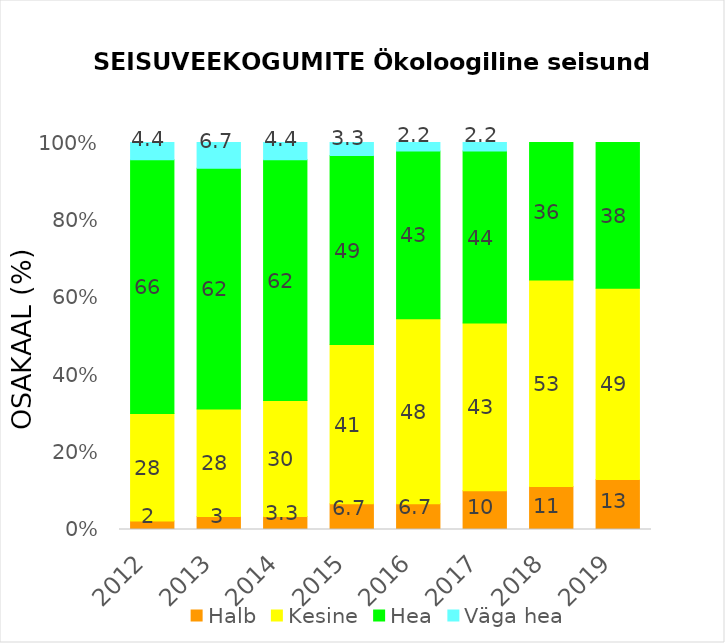
| Category | Halb | Kesine | Hea | Väga hea |
|---|---|---|---|---|
| 2012.0 | 2.222 | 27.778 | 65.556 | 4.444 |
| 2013.0 | 3.333 | 27.778 | 62.222 | 6.667 |
| 2014.0 | 3.333 | 30 | 62.222 | 4.444 |
| 2015.0 | 6.667 | 41.111 | 48.889 | 3.333 |
| 2016.0 | 6.667 | 47.778 | 43.333 | 2.222 |
| 2017.0 | 10 | 43.333 | 44.444 | 2.222 |
| 2018.0 | 11.111 | 53.333 | 35.556 | 0 |
| 2019.0 | 12.903 | 49.462 | 37.634 | 0 |